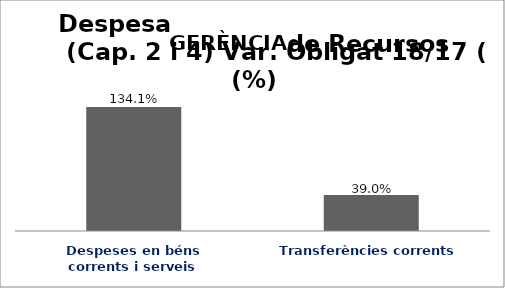
| Category | Series 0 |
|---|---|
| Despeses en béns corrents i serveis | 1.341 |
| Transferències corrents | 0.39 |